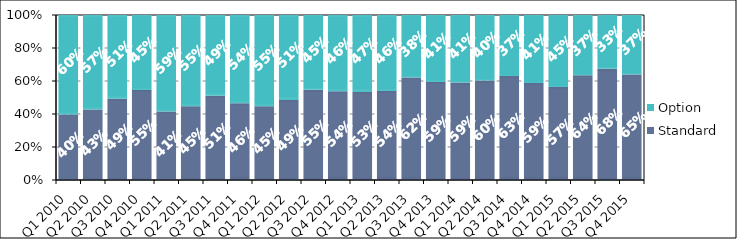
| Category | Standard | Option |
|---|---|---|
| Q1 2010 | 0.397 | 0.603 |
| Q2 2010 | 0.428 | 0.572 |
| Q3 2010 | 0.492 | 0.508 |
| Q4 2010 | 0.546 | 0.454 |
| Q1 2011 | 0.415 | 0.585 |
| Q2 2011 | 0.447 | 0.553 |
| Q3 2011 | 0.511 | 0.489 |
| Q4 2011 | 0.465 | 0.535 |
| Q1 2012 | 0.447 | 0.553 |
| Q2 2012 | 0.485 | 0.515 |
| Q3 2012 | 0.548 | 0.452 |
| Q4 2012 | 0.538 | 0.462 |
| Q1 2013 | 0.534 | 0.466 |
| Q2 2013 | 0.539 | 0.461 |
| Q3 2013 | 0.621 | 0.379 |
| Q4 2013 | 0.594 | 0.406 |
| Q1 2014 | 0.591 | 0.409 |
| Q2 2014 | 0.602 | 0.398 |
| Q3 2014 | 0.63 | 0.37 |
| Q4 2014 | 0.588 | 0.412 |
| Q1 2015 | 0.575 | 0.446 |
| Q2 2015 | 0.645 | 0.371 |
| Q3 2015 | 0.682 | 0.329 |
| Q4 2015 | 0.65 | 0.366 |